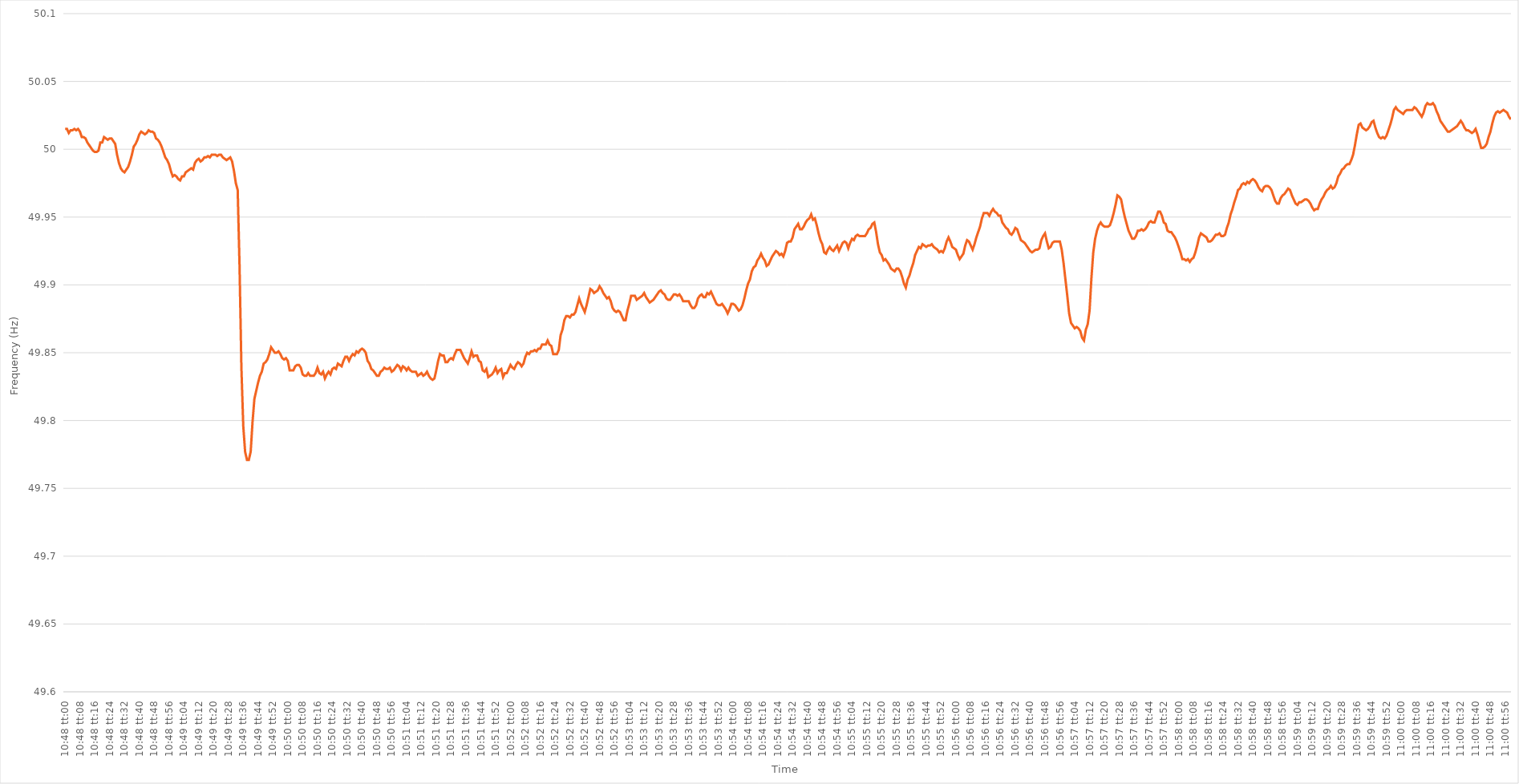
| Category | Series 0 |
|---|---|
| 0.45 | 50.015 |
| 0.45001157407407405 | 50.015 |
| 0.4500231481481482 | 50.012 |
| 0.45003472222222224 | 50.014 |
| 0.45004629629629633 | 50.014 |
| 0.45005787037037037 | 50.015 |
| 0.4500694444444444 | 50.014 |
| 0.4500810185185185 | 50.015 |
| 0.45009259259259254 | 50.013 |
| 0.4501041666666667 | 50.009 |
| 0.45011574074074073 | 50.009 |
| 0.4501273148148148 | 50.008 |
| 0.45013888888888887 | 50.005 |
| 0.45015046296296296 | 50.003 |
| 0.450162037037037 | 50.001 |
| 0.45017361111111115 | 49.999 |
| 0.4501851851851852 | 49.998 |
| 0.4501967592592593 | 49.998 |
| 0.4502083333333333 | 49.999 |
| 0.4502199074074074 | 50.005 |
| 0.45023148148148145 | 50.005 |
| 0.4502430555555556 | 50.009 |
| 0.45025462962962964 | 50.008 |
| 0.45026620370370374 | 50.007 |
| 0.4502777777777778 | 50.008 |
| 0.4502893518518518 | 50.008 |
| 0.4503009259259259 | 50.006 |
| 0.45031249999999995 | 50.004 |
| 0.4503240740740741 | 49.996 |
| 0.45033564814814814 | 49.99 |
| 0.45034722222222223 | 49.986 |
| 0.45035879629629627 | 49.984 |
| 0.45037037037037037 | 49.983 |
| 0.4503819444444444 | 49.985 |
| 0.45039351851851855 | 49.987 |
| 0.4504050925925926 | 49.991 |
| 0.4504166666666667 | 49.996 |
| 0.4504282407407407 | 50.002 |
| 0.4504398148148148 | 50.004 |
| 0.45045138888888886 | 50.007 |
| 0.450462962962963 | 50.011 |
| 0.45047453703703705 | 50.013 |
| 0.45048611111111114 | 50.012 |
| 0.4504976851851852 | 50.011 |
| 0.4505092592592593 | 50.012 |
| 0.4505208333333333 | 50.014 |
| 0.45053240740740735 | 50.013 |
| 0.4505439814814815 | 50.013 |
| 0.45055555555555554 | 50.012 |
| 0.45056712962962964 | 50.008 |
| 0.4505787037037037 | 50.007 |
| 0.45059027777777777 | 50.005 |
| 0.4506018518518518 | 50.002 |
| 0.45061342592592596 | 49.998 |
| 0.450625 | 49.994 |
| 0.4506365740740741 | 49.992 |
| 0.45064814814814813 | 49.989 |
| 0.4506597222222222 | 49.984 |
| 0.45067129629629626 | 49.98 |
| 0.4506828703703704 | 49.981 |
| 0.45069444444444445 | 49.98 |
| 0.45070601851851855 | 49.978 |
| 0.4507175925925926 | 49.977 |
| 0.4507291666666667 | 49.98 |
| 0.4507407407407407 | 49.98 |
| 0.45075231481481487 | 49.983 |
| 0.4507638888888889 | 49.984 |
| 0.45077546296296295 | 49.985 |
| 0.45078703703703704 | 49.986 |
| 0.4507986111111111 | 49.985 |
| 0.4508101851851852 | 49.99 |
| 0.4508217592592592 | 49.992 |
| 0.45083333333333336 | 49.993 |
| 0.4508449074074074 | 49.991 |
| 0.4508564814814815 | 49.992 |
| 0.45086805555555554 | 49.994 |
| 0.45087962962962963 | 49.994 |
| 0.45089120370370367 | 49.995 |
| 0.4509027777777778 | 49.994 |
| 0.45091435185185186 | 49.996 |
| 0.45092592592592595 | 49.996 |
| 0.4509375 | 49.996 |
| 0.4509490740740741 | 49.995 |
| 0.4509606481481481 | 49.996 |
| 0.4509722222222223 | 49.996 |
| 0.4509837962962963 | 49.994 |
| 0.45099537037037035 | 49.993 |
| 0.45100694444444445 | 49.992 |
| 0.4510185185185185 | 49.993 |
| 0.4510300925925926 | 49.994 |
| 0.4510416666666666 | 49.991 |
| 0.45105324074074077 | 49.984 |
| 0.4510648148148148 | 49.975 |
| 0.4510763888888889 | 49.97 |
| 0.45108796296296294 | 49.914 |
| 0.45109953703703703 | 49.839 |
| 0.4511111111111111 | 49.796 |
| 0.4511226851851852 | 49.777 |
| 0.45113425925925926 | 49.771 |
| 0.45114583333333336 | 49.771 |
| 0.4511574074074074 | 49.777 |
| 0.4511689814814815 | 49.799 |
| 0.45118055555555553 | 49.816 |
| 0.4511921296296297 | 49.822 |
| 0.4512037037037037 | 49.828 |
| 0.4512152777777778 | 49.833 |
| 0.45122685185185185 | 49.836 |
| 0.4512384259259259 | 49.842 |
| 0.45125 | 49.843 |
| 0.451261574074074 | 49.845 |
| 0.4512731481481482 | 49.849 |
| 0.4512847222222222 | 49.854 |
| 0.4512962962962963 | 49.852 |
| 0.45130787037037035 | 49.85 |
| 0.45131944444444444 | 49.85 |
| 0.4513310185185185 | 49.851 |
| 0.45134259259259263 | 49.849 |
| 0.45135416666666667 | 49.846 |
| 0.45136574074074076 | 49.845 |
| 0.4513773148148148 | 49.846 |
| 0.4513888888888889 | 49.844 |
| 0.45140046296296293 | 49.837 |
| 0.4514120370370371 | 49.837 |
| 0.4514236111111111 | 49.837 |
| 0.4514351851851852 | 49.84 |
| 0.45144675925925926 | 49.841 |
| 0.45145833333333335 | 49.841 |
| 0.4514699074074074 | 49.839 |
| 0.45148148148148143 | 49.834 |
| 0.4514930555555556 | 49.833 |
| 0.4515046296296296 | 49.833 |
| 0.4515162037037037 | 49.835 |
| 0.45152777777777775 | 49.833 |
| 0.45153935185185184 | 49.833 |
| 0.4515509259259259 | 49.833 |
| 0.45156250000000003 | 49.835 |
| 0.45157407407407407 | 49.839 |
| 0.45158564814814817 | 49.835 |
| 0.4515972222222222 | 49.834 |
| 0.4516087962962963 | 49.836 |
| 0.45162037037037034 | 49.831 |
| 0.4516319444444445 | 49.834 |
| 0.4516435185185185 | 49.836 |
| 0.4516550925925926 | 49.834 |
| 0.45166666666666666 | 49.838 |
| 0.45167824074074076 | 49.839 |
| 0.4516898148148148 | 49.838 |
| 0.45170138888888894 | 49.842 |
| 0.451712962962963 | 49.841 |
| 0.451724537037037 | 49.84 |
| 0.4517361111111111 | 49.844 |
| 0.45174768518518515 | 49.847 |
| 0.45175925925925925 | 49.847 |
| 0.4517708333333333 | 49.844 |
| 0.45178240740740744 | 49.847 |
| 0.4517939814814815 | 49.849 |
| 0.45180555555555557 | 49.848 |
| 0.4518171296296296 | 49.851 |
| 0.4518287037037037 | 49.85 |
| 0.45184027777777774 | 49.852 |
| 0.4518518518518519 | 49.853 |
| 0.45186342592592593 | 49.852 |
| 0.451875 | 49.85 |
| 0.45188657407407407 | 49.844 |
| 0.45189814814814816 | 49.842 |
| 0.4519097222222222 | 49.838 |
| 0.45192129629629635 | 49.837 |
| 0.4519328703703704 | 49.835 |
| 0.4519444444444444 | 49.833 |
| 0.4519560185185185 | 49.833 |
| 0.45196759259259256 | 49.836 |
| 0.45197916666666665 | 49.837 |
| 0.4519907407407407 | 49.839 |
| 0.45200231481481484 | 49.838 |
| 0.4520138888888889 | 49.838 |
| 0.452025462962963 | 49.839 |
| 0.452037037037037 | 49.836 |
| 0.4520486111111111 | 49.837 |
| 0.45206018518518515 | 49.839 |
| 0.4520717592592593 | 49.841 |
| 0.45208333333333334 | 49.84 |
| 0.45209490740740743 | 49.837 |
| 0.45210648148148147 | 49.84 |
| 0.45211805555555556 | 49.839 |
| 0.4521296296296296 | 49.837 |
| 0.45214120370370375 | 49.839 |
| 0.4521527777777778 | 49.837 |
| 0.4521643518518519 | 49.836 |
| 0.4521759259259259 | 49.836 |
| 0.45218749999999996 | 49.836 |
| 0.45219907407407406 | 49.833 |
| 0.4522106481481481 | 49.834 |
| 0.45222222222222225 | 49.835 |
| 0.4522337962962963 | 49.833 |
| 0.4522453703703704 | 49.834 |
| 0.4522569444444444 | 49.836 |
| 0.4522685185185185 | 49.833 |
| 0.45228009259259255 | 49.831 |
| 0.4522916666666667 | 49.83 |
| 0.45230324074074074 | 49.831 |
| 0.45231481481481484 | 49.837 |
| 0.4523263888888889 | 49.844 |
| 0.45233796296296297 | 49.849 |
| 0.452349537037037 | 49.848 |
| 0.45236111111111116 | 49.848 |
| 0.4523726851851852 | 49.843 |
| 0.4523842592592593 | 49.843 |
| 0.45239583333333333 | 49.845 |
| 0.4524074074074074 | 49.846 |
| 0.45241898148148146 | 49.845 |
| 0.4524305555555555 | 49.849 |
| 0.45244212962962965 | 49.852 |
| 0.4524537037037037 | 49.852 |
| 0.4524652777777778 | 49.852 |
| 0.4524768518518518 | 49.849 |
| 0.4524884259259259 | 49.846 |
| 0.45249999999999996 | 49.844 |
| 0.4525115740740741 | 49.842 |
| 0.45252314814814815 | 49.846 |
| 0.45253472222222224 | 49.851 |
| 0.4525462962962963 | 49.847 |
| 0.4525578703703704 | 49.848 |
| 0.4525694444444444 | 49.848 |
| 0.45258101851851856 | 49.844 |
| 0.4525925925925926 | 49.843 |
| 0.4526041666666667 | 49.837 |
| 0.45261574074074074 | 49.836 |
| 0.45262731481481483 | 49.838 |
| 0.45263888888888887 | 49.832 |
| 0.452650462962963 | 49.833 |
| 0.45266203703703706 | 49.834 |
| 0.4526736111111111 | 49.836 |
| 0.4526851851851852 | 49.839 |
| 0.45269675925925923 | 49.835 |
| 0.4527083333333333 | 49.837 |
| 0.45271990740740736 | 49.838 |
| 0.4527314814814815 | 49.832 |
| 0.45274305555555555 | 49.835 |
| 0.45275462962962965 | 49.835 |
| 0.4527662037037037 | 49.838 |
| 0.4527777777777778 | 49.841 |
| 0.4527893518518518 | 49.839 |
| 0.45280092592592597 | 49.838 |
| 0.4528125 | 49.841 |
| 0.4528240740740741 | 49.843 |
| 0.45283564814814814 | 49.842 |
| 0.45284722222222223 | 49.84 |
| 0.4528587962962963 | 49.842 |
| 0.4528703703703704 | 49.847 |
| 0.45288194444444446 | 49.85 |
| 0.4528935185185185 | 49.849 |
| 0.4529050925925926 | 49.851 |
| 0.45291666666666663 | 49.851 |
| 0.45292824074074073 | 49.852 |
| 0.45293981481481477 | 49.851 |
| 0.4529513888888889 | 49.853 |
| 0.45296296296296296 | 49.853 |
| 0.45297453703703705 | 49.856 |
| 0.4529861111111111 | 49.856 |
| 0.4529976851851852 | 49.856 |
| 0.4530092592592592 | 49.859 |
| 0.4530208333333334 | 49.856 |
| 0.4530324074074074 | 49.855 |
| 0.4530439814814815 | 49.849 |
| 0.45305555555555554 | 49.849 |
| 0.45306712962962964 | 49.849 |
| 0.4530787037037037 | 49.852 |
| 0.45309027777777783 | 49.863 |
| 0.45310185185185187 | 49.867 |
| 0.45311342592592596 | 49.874 |
| 0.453125 | 49.877 |
| 0.45313657407407404 | 49.877 |
| 0.45314814814814813 | 49.876 |
| 0.45315972222222217 | 49.878 |
| 0.4531712962962963 | 49.878 |
| 0.45318287037037036 | 49.88 |
| 0.45319444444444446 | 49.885 |
| 0.4532060185185185 | 49.89 |
| 0.4532175925925926 | 49.886 |
| 0.4532291666666666 | 49.883 |
| 0.4532407407407408 | 49.88 |
| 0.4532523148148148 | 49.885 |
| 0.4532638888888889 | 49.891 |
| 0.45327546296296295 | 49.897 |
| 0.45328703703703704 | 49.896 |
| 0.4532986111111111 | 49.894 |
| 0.45331018518518523 | 49.895 |
| 0.45332175925925927 | 49.896 |
| 0.45333333333333337 | 49.899 |
| 0.4533449074074074 | 49.897 |
| 0.4533564814814815 | 49.894 |
| 0.45336805555555554 | 49.892 |
| 0.4533796296296296 | 49.89 |
| 0.4533912037037037 | 49.891 |
| 0.45340277777777777 | 49.888 |
| 0.45341435185185186 | 49.883 |
| 0.4534259259259259 | 49.881 |
| 0.4534375 | 49.88 |
| 0.45344907407407403 | 49.881 |
| 0.4534606481481482 | 49.88 |
| 0.4534722222222222 | 49.877 |
| 0.4534837962962963 | 49.874 |
| 0.45349537037037035 | 49.874 |
| 0.45350694444444445 | 49.881 |
| 0.4535185185185185 | 49.886 |
| 0.45353009259259264 | 49.892 |
| 0.4535416666666667 | 49.892 |
| 0.45355324074074077 | 49.892 |
| 0.4535648148148148 | 49.889 |
| 0.4535763888888889 | 49.89 |
| 0.45358796296296294 | 49.891 |
| 0.453599537037037 | 49.892 |
| 0.45361111111111113 | 49.894 |
| 0.45362268518518517 | 49.891 |
| 0.45363425925925926 | 49.889 |
| 0.4536458333333333 | 49.887 |
| 0.4536574074074074 | 49.888 |
| 0.45366898148148144 | 49.889 |
| 0.4536805555555556 | 49.891 |
| 0.4536921296296296 | 49.893 |
| 0.4537037037037037 | 49.895 |
| 0.45371527777777776 | 49.896 |
| 0.45372685185185185 | 49.894 |
| 0.4537384259259259 | 49.893 |
| 0.45375000000000004 | 49.89 |
| 0.4537615740740741 | 49.889 |
| 0.4537731481481482 | 49.889 |
| 0.4537847222222222 | 49.891 |
| 0.4537962962962963 | 49.893 |
| 0.45380787037037035 | 49.893 |
| 0.4538194444444445 | 49.892 |
| 0.45383101851851854 | 49.893 |
| 0.4538425925925926 | 49.891 |
| 0.45385416666666667 | 49.888 |
| 0.4538657407407407 | 49.888 |
| 0.4538773148148148 | 49.888 |
| 0.45388888888888884 | 49.888 |
| 0.453900462962963 | 49.885 |
| 0.45391203703703703 | 49.883 |
| 0.4539236111111111 | 49.883 |
| 0.45393518518518516 | 49.885 |
| 0.45394675925925926 | 49.89 |
| 0.4539583333333333 | 49.892 |
| 0.45396990740740745 | 49.893 |
| 0.4539814814814815 | 49.891 |
| 0.4539930555555556 | 49.891 |
| 0.4540046296296296 | 49.894 |
| 0.4540162037037037 | 49.893 |
| 0.45402777777777775 | 49.895 |
| 0.4540393518518519 | 49.892 |
| 0.45405092592592594 | 49.889 |
| 0.45406250000000004 | 49.886 |
| 0.4540740740740741 | 49.885 |
| 0.4540856481481481 | 49.885 |
| 0.4540972222222222 | 49.886 |
| 0.45410879629629625 | 49.884 |
| 0.4541203703703704 | 49.882 |
| 0.45413194444444444 | 49.879 |
| 0.45414351851851853 | 49.882 |
| 0.45415509259259257 | 49.886 |
| 0.45416666666666666 | 49.886 |
| 0.4541782407407407 | 49.885 |
| 0.45418981481481485 | 49.883 |
| 0.4542013888888889 | 49.881 |
| 0.454212962962963 | 49.882 |
| 0.454224537037037 | 49.885 |
| 0.4542361111111111 | 49.89 |
| 0.45424768518518516 | 49.896 |
| 0.4542592592592593 | 49.901 |
| 0.45427083333333335 | 49.904 |
| 0.45428240740740744 | 49.91 |
| 0.4542939814814815 | 49.913 |
| 0.4543055555555556 | 49.914 |
| 0.4543171296296296 | 49.918 |
| 0.45432870370370365 | 49.92 |
| 0.4543402777777778 | 49.923 |
| 0.45435185185185184 | 49.92 |
| 0.45436342592592593 | 49.918 |
| 0.454375 | 49.914 |
| 0.45438657407407407 | 49.915 |
| 0.4543981481481481 | 49.918 |
| 0.45440972222222226 | 49.921 |
| 0.4544212962962963 | 49.923 |
| 0.4544328703703704 | 49.925 |
| 0.45444444444444443 | 49.924 |
| 0.4544560185185185 | 49.922 |
| 0.45446759259259256 | 49.923 |
| 0.4544791666666667 | 49.921 |
| 0.45449074074074075 | 49.925 |
| 0.45450231481481485 | 49.931 |
| 0.4545138888888889 | 49.932 |
| 0.454525462962963 | 49.932 |
| 0.454537037037037 | 49.935 |
| 0.45454861111111106 | 49.941 |
| 0.4545601851851852 | 49.943 |
| 0.45457175925925924 | 49.945 |
| 0.45458333333333334 | 49.941 |
| 0.4545949074074074 | 49.941 |
| 0.4546064814814815 | 49.943 |
| 0.4546180555555555 | 49.946 |
| 0.45462962962962966 | 49.948 |
| 0.4546412037037037 | 49.949 |
| 0.4546527777777778 | 49.952 |
| 0.45466435185185183 | 49.948 |
| 0.45467592592592593 | 49.949 |
| 0.45468749999999997 | 49.944 |
| 0.4546990740740741 | 49.938 |
| 0.45471064814814816 | 49.933 |
| 0.45472222222222225 | 49.93 |
| 0.4547337962962963 | 49.924 |
| 0.4547453703703704 | 49.923 |
| 0.4547569444444444 | 49.926 |
| 0.45476851851851857 | 49.928 |
| 0.4547800925925926 | 49.926 |
| 0.45479166666666665 | 49.925 |
| 0.45480324074074074 | 49.927 |
| 0.4548148148148148 | 49.929 |
| 0.4548263888888889 | 49.925 |
| 0.4548379629629629 | 49.928 |
| 0.45484953703703707 | 49.931 |
| 0.4548611111111111 | 49.932 |
| 0.4548726851851852 | 49.931 |
| 0.45488425925925924 | 49.927 |
| 0.45489583333333333 | 49.931 |
| 0.45490740740740737 | 49.934 |
| 0.4549189814814815 | 49.933 |
| 0.45493055555555556 | 49.936 |
| 0.45494212962962965 | 49.937 |
| 0.4549537037037037 | 49.936 |
| 0.4549652777777778 | 49.936 |
| 0.4549768518518518 | 49.936 |
| 0.454988425925926 | 49.936 |
| 0.455 | 49.938 |
| 0.4550115740740741 | 49.941 |
| 0.45502314814814815 | 49.942 |
| 0.4550347222222222 | 49.945 |
| 0.4550462962962963 | 49.946 |
| 0.4550578703703703 | 49.939 |
| 0.45506944444444447 | 49.93 |
| 0.4550810185185185 | 49.924 |
| 0.4550925925925926 | 49.922 |
| 0.45510416666666664 | 49.918 |
| 0.45511574074074074 | 49.919 |
| 0.4551273148148148 | 49.917 |
| 0.4551388888888889 | 49.915 |
| 0.45515046296296297 | 49.912 |
| 0.45516203703703706 | 49.911 |
| 0.4551736111111111 | 49.91 |
| 0.4551851851851852 | 49.912 |
| 0.45519675925925923 | 49.912 |
| 0.4552083333333334 | 49.91 |
| 0.4552199074074074 | 49.906 |
| 0.4552314814814815 | 49.901 |
| 0.45524305555555555 | 49.898 |
| 0.45525462962962965 | 49.904 |
| 0.4552662037037037 | 49.907 |
| 0.4552777777777777 | 49.912 |
| 0.4552893518518519 | 49.916 |
| 0.4553009259259259 | 49.922 |
| 0.4553125 | 49.925 |
| 0.45532407407407405 | 49.928 |
| 0.45533564814814814 | 49.927 |
| 0.4553472222222222 | 49.93 |
| 0.45535879629629633 | 49.929 |
| 0.45537037037037037 | 49.928 |
| 0.45538194444444446 | 49.929 |
| 0.4553935185185185 | 49.929 |
| 0.4554050925925926 | 49.93 |
| 0.45541666666666664 | 49.928 |
| 0.4554282407407408 | 49.927 |
| 0.4554398148148148 | 49.926 |
| 0.4554513888888889 | 49.924 |
| 0.45546296296296296 | 49.925 |
| 0.45547453703703705 | 49.924 |
| 0.4554861111111111 | 49.927 |
| 0.45549768518518513 | 49.932 |
| 0.4555092592592593 | 49.935 |
| 0.4555208333333333 | 49.932 |
| 0.4555324074074074 | 49.928 |
| 0.45554398148148145 | 49.927 |
| 0.45555555555555555 | 49.926 |
| 0.4555671296296296 | 49.922 |
| 0.45557870370370374 | 49.919 |
| 0.4555902777777778 | 49.921 |
| 0.45560185185185187 | 49.923 |
| 0.4556134259259259 | 49.929 |
| 0.455625 | 49.933 |
| 0.45563657407407404 | 49.932 |
| 0.4556481481481482 | 49.929 |
| 0.45565972222222223 | 49.926 |
| 0.4556712962962963 | 49.93 |
| 0.45568287037037036 | 49.935 |
| 0.45569444444444446 | 49.939 |
| 0.4557060185185185 | 49.943 |
| 0.45571759259259265 | 49.949 |
| 0.4557291666666667 | 49.953 |
| 0.4557407407407407 | 49.953 |
| 0.4557523148148148 | 49.953 |
| 0.45576388888888886 | 49.951 |
| 0.45577546296296295 | 49.954 |
| 0.455787037037037 | 49.956 |
| 0.45579861111111114 | 49.954 |
| 0.4558101851851852 | 49.953 |
| 0.4558217592592593 | 49.951 |
| 0.4558333333333333 | 49.951 |
| 0.4558449074074074 | 49.946 |
| 0.45585648148148145 | 49.944 |
| 0.4558680555555556 | 49.942 |
| 0.45587962962962963 | 49.941 |
| 0.45589120370370373 | 49.938 |
| 0.45590277777777777 | 49.937 |
| 0.45591435185185186 | 49.939 |
| 0.4559259259259259 | 49.942 |
| 0.45593750000000005 | 49.941 |
| 0.4559490740740741 | 49.937 |
| 0.4559606481481482 | 49.933 |
| 0.4559722222222222 | 49.932 |
| 0.45598379629629626 | 49.931 |
| 0.45599537037037036 | 49.929 |
| 0.4560069444444444 | 49.927 |
| 0.45601851851851855 | 49.925 |
| 0.4560300925925926 | 49.924 |
| 0.4560416666666667 | 49.925 |
| 0.4560532407407407 | 49.926 |
| 0.4560648148148148 | 49.926 |
| 0.45607638888888885 | 49.927 |
| 0.456087962962963 | 49.933 |
| 0.45609953703703704 | 49.936 |
| 0.45611111111111113 | 49.938 |
| 0.4561226851851852 | 49.932 |
| 0.45613425925925927 | 49.927 |
| 0.4561458333333333 | 49.928 |
| 0.45615740740740746 | 49.931 |
| 0.4561689814814815 | 49.932 |
| 0.4561805555555556 | 49.932 |
| 0.45619212962962963 | 49.932 |
| 0.45620370370370367 | 49.932 |
| 0.45621527777777776 | 49.926 |
| 0.4562268518518518 | 49.916 |
| 0.45623842592592595 | 49.904 |
| 0.45625 | 49.892 |
| 0.4562615740740741 | 49.879 |
| 0.4562731481481481 | 49.872 |
| 0.4562847222222222 | 49.87 |
| 0.45629629629629626 | 49.868 |
| 0.4563078703703704 | 49.869 |
| 0.45631944444444444 | 49.868 |
| 0.45633101851851854 | 49.866 |
| 0.4563425925925926 | 49.861 |
| 0.45635416666666667 | 49.859 |
| 0.4563657407407407 | 49.867 |
| 0.45637731481481486 | 49.871 |
| 0.4563888888888889 | 49.881 |
| 0.456400462962963 | 49.905 |
| 0.45641203703703703 | 49.924 |
| 0.4564236111111111 | 49.934 |
| 0.45643518518518517 | 49.94 |
| 0.4564467592592592 | 49.944 |
| 0.45645833333333335 | 49.946 |
| 0.4564699074074074 | 49.944 |
| 0.4564814814814815 | 49.943 |
| 0.4564930555555555 | 49.943 |
| 0.4565046296296296 | 49.943 |
| 0.45651620370370366 | 49.944 |
| 0.4565277777777778 | 49.948 |
| 0.45653935185185185 | 49.953 |
| 0.45655092592592594 | 49.959 |
| 0.4565625 | 49.966 |
| 0.4565740740740741 | 49.965 |
| 0.4565856481481481 | 49.963 |
| 0.45659722222222227 | 49.956 |
| 0.4566087962962963 | 49.95 |
| 0.4566203703703704 | 49.945 |
| 0.45663194444444444 | 49.94 |
| 0.45664351851851853 | 49.937 |
| 0.45665509259259257 | 49.934 |
| 0.4566666666666667 | 49.934 |
| 0.45667824074074076 | 49.936 |
| 0.4566898148148148 | 49.94 |
| 0.4567013888888889 | 49.94 |
| 0.45671296296296293 | 49.941 |
| 0.456724537037037 | 49.94 |
| 0.45673611111111106 | 49.941 |
| 0.4567476851851852 | 49.943 |
| 0.45675925925925925 | 49.946 |
| 0.45677083333333335 | 49.947 |
| 0.4567824074074074 | 49.946 |
| 0.4567939814814815 | 49.946 |
| 0.4568055555555555 | 49.95 |
| 0.45681712962962967 | 49.954 |
| 0.4568287037037037 | 49.954 |
| 0.4568402777777778 | 49.951 |
| 0.45685185185185184 | 49.946 |
| 0.45686342592592594 | 49.945 |
| 0.456875 | 49.94 |
| 0.4568865740740741 | 49.939 |
| 0.45689814814814816 | 49.939 |
| 0.45690972222222226 | 49.937 |
| 0.4569212962962963 | 49.935 |
| 0.45693287037037034 | 49.932 |
| 0.45694444444444443 | 49.928 |
| 0.45695601851851847 | 49.924 |
| 0.4569675925925926 | 49.919 |
| 0.45697916666666666 | 49.919 |
| 0.45699074074074075 | 49.918 |
| 0.4570023148148148 | 49.919 |
| 0.4570138888888889 | 49.917 |
| 0.4570254629629629 | 49.919 |
| 0.4570370370370371 | 49.92 |
| 0.4570486111111111 | 49.924 |
| 0.4570601851851852 | 49.929 |
| 0.45707175925925925 | 49.935 |
| 0.45708333333333334 | 49.938 |
| 0.4570949074074074 | 49.937 |
| 0.45710648148148153 | 49.936 |
| 0.45711805555555557 | 49.935 |
| 0.45712962962962966 | 49.932 |
| 0.4571412037037037 | 49.932 |
| 0.45715277777777774 | 49.933 |
| 0.45716435185185184 | 49.935 |
| 0.4571759259259259 | 49.937 |
| 0.4571875 | 49.937 |
| 0.45719907407407406 | 49.938 |
| 0.45721064814814816 | 49.936 |
| 0.4572222222222222 | 49.936 |
| 0.4572337962962963 | 49.937 |
| 0.45724537037037033 | 49.942 |
| 0.4572569444444445 | 49.946 |
| 0.4572685185185185 | 49.952 |
| 0.4572800925925926 | 49.956 |
| 0.45729166666666665 | 49.961 |
| 0.45730324074074075 | 49.965 |
| 0.4573148148148148 | 49.97 |
| 0.45732638888888894 | 49.971 |
| 0.457337962962963 | 49.974 |
| 0.45734953703703707 | 49.975 |
| 0.4573611111111111 | 49.974 |
| 0.4573726851851852 | 49.976 |
| 0.45738425925925924 | 49.975 |
| 0.4573958333333333 | 49.977 |
| 0.45740740740740743 | 49.978 |
| 0.45741898148148147 | 49.977 |
| 0.45743055555555556 | 49.975 |
| 0.4574421296296296 | 49.972 |
| 0.4574537037037037 | 49.97 |
| 0.45746527777777773 | 49.969 |
| 0.4574768518518519 | 49.972 |
| 0.4574884259259259 | 49.973 |
| 0.4575 | 49.973 |
| 0.45751157407407406 | 49.972 |
| 0.45752314814814815 | 49.97 |
| 0.4575347222222222 | 49.966 |
| 0.45754629629629634 | 49.962 |
| 0.4575578703703704 | 49.96 |
| 0.4575694444444445 | 49.96 |
| 0.4575810185185185 | 49.964 |
| 0.4575925925925926 | 49.966 |
| 0.45760416666666665 | 49.967 |
| 0.4576157407407408 | 49.969 |
| 0.45762731481481483 | 49.971 |
| 0.4576388888888889 | 49.97 |
| 0.45765046296296297 | 49.966 |
| 0.457662037037037 | 49.963 |
| 0.4576736111111111 | 49.96 |
| 0.45768518518518514 | 49.959 |
| 0.4576967592592593 | 49.961 |
| 0.45770833333333333 | 49.961 |
| 0.4577199074074074 | 49.962 |
| 0.45773148148148146 | 49.963 |
| 0.45774305555555556 | 49.963 |
| 0.4577546296296296 | 49.962 |
| 0.45776620370370374 | 49.96 |
| 0.4577777777777778 | 49.957 |
| 0.4577893518518519 | 49.955 |
| 0.4578009259259259 | 49.956 |
| 0.4578125 | 49.956 |
| 0.45782407407407405 | 49.96 |
| 0.4578356481481482 | 49.963 |
| 0.45784722222222224 | 49.965 |
| 0.45785879629629633 | 49.968 |
| 0.45787037037037037 | 49.97 |
| 0.4578819444444444 | 49.971 |
| 0.4578935185185185 | 49.973 |
| 0.45790509259259254 | 49.971 |
| 0.4579166666666667 | 49.972 |
| 0.45792824074074073 | 49.975 |
| 0.4579398148148148 | 49.98 |
| 0.45795138888888887 | 49.982 |
| 0.45796296296296296 | 49.985 |
| 0.457974537037037 | 49.986 |
| 0.45798611111111115 | 49.988 |
| 0.4579976851851852 | 49.989 |
| 0.4580092592592593 | 49.989 |
| 0.4580208333333333 | 49.992 |
| 0.4580324074074074 | 49.996 |
| 0.45804398148148145 | 50.003 |
| 0.4580555555555556 | 50.011 |
| 0.45806712962962964 | 50.018 |
| 0.45807870370370374 | 50.019 |
| 0.4580902777777778 | 50.016 |
| 0.4581018518518518 | 50.015 |
| 0.4581134259259259 | 50.014 |
| 0.45812499999999995 | 50.015 |
| 0.4581365740740741 | 50.017 |
| 0.45814814814814814 | 50.02 |
| 0.45815972222222223 | 50.021 |
| 0.45817129629629627 | 50.016 |
| 0.45818287037037037 | 50.012 |
| 0.4581944444444444 | 50.009 |
| 0.45820601851851855 | 50.008 |
| 0.4582175925925926 | 50.009 |
| 0.4582291666666667 | 50.008 |
| 0.4582407407407407 | 50.01 |
| 0.4582523148148148 | 50.014 |
| 0.45826388888888886 | 50.018 |
| 0.458275462962963 | 50.023 |
| 0.45828703703703705 | 50.029 |
| 0.45829861111111114 | 50.031 |
| 0.4583101851851852 | 50.029 |
| 0.4583217592592593 | 50.028 |
| 0.4583333333333333 | 50.027 |
| 0.45834490740740735 | 50.026 |
| 0.4583564814814815 | 50.028 |
| 0.45836805555555554 | 50.029 |
| 0.45837962962962964 | 50.029 |
| 0.4583912037037037 | 50.029 |
| 0.45840277777777777 | 50.029 |
| 0.4584143518518518 | 50.031 |
| 0.45842592592592596 | 50.03 |
| 0.4584375 | 50.028 |
| 0.4584490740740741 | 50.026 |
| 0.45846064814814813 | 50.024 |
| 0.4584722222222222 | 50.027 |
| 0.45848379629629626 | 50.032 |
| 0.4584953703703704 | 50.034 |
| 0.45850694444444445 | 50.033 |
| 0.45851851851851855 | 50.033 |
| 0.4585300925925926 | 50.034 |
| 0.4585416666666667 | 50.032 |
| 0.4585532407407407 | 50.028 |
| 0.45856481481481487 | 50.025 |
| 0.4585763888888889 | 50.021 |
| 0.45858796296296295 | 50.019 |
| 0.45859953703703704 | 50.017 |
| 0.4586111111111111 | 50.015 |
| 0.4586226851851852 | 50.013 |
| 0.4586342592592592 | 50.013 |
| 0.45864583333333336 | 50.014 |
| 0.4586574074074074 | 50.015 |
| 0.4586689814814815 | 50.016 |
| 0.45868055555555554 | 50.017 |
| 0.45869212962962963 | 50.019 |
| 0.45870370370370367 | 50.021 |
| 0.4587152777777778 | 50.019 |
| 0.45872685185185186 | 50.016 |
| 0.45873842592592595 | 50.014 |
| 0.45875 | 50.014 |
| 0.4587615740740741 | 50.013 |
| 0.4587731481481481 | 50.012 |
| 0.4587847222222223 | 50.013 |
| 0.4587962962962963 | 50.015 |
| 0.45880787037037035 | 50.011 |
| 0.45881944444444445 | 50.006 |
| 0.4588310185185185 | 50.001 |
| 0.4588425925925926 | 50.001 |
| 0.4588541666666666 | 50.002 |
| 0.45886574074074077 | 50.004 |
| 0.4588773148148148 | 50.009 |
| 0.4588888888888889 | 50.013 |
| 0.45890046296296294 | 50.019 |
| 0.45891203703703703 | 50.024 |
| 0.4589236111111111 | 50.027 |
| 0.4589351851851852 | 50.028 |
| 0.45894675925925926 | 50.027 |
| 0.45895833333333336 | 50.028 |
| 0.4589699074074074 | 50.029 |
| 0.4589814814814815 | 50.028 |
| 0.45899305555555553 | 50.027 |
| 0.4590046296296297 | 50.024 |
| 0.4590162037037037 | 50.022 |